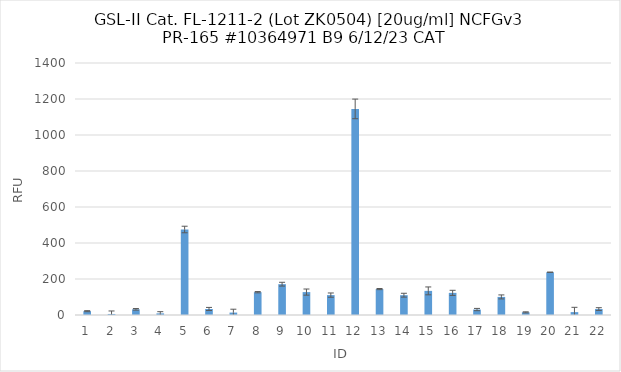
| Category | RFU |
|---|---|
| 0 | 21.25 |
| 1 | 5.75 |
| 2 | 31.5 |
| 3 | 9 |
| 4 | 475 |
| 5 | 33.5 |
| 6 | 13.5 |
| 7 | 126.75 |
| 8 | 171.25 |
| 9 | 127.25 |
| 10 | 110.5 |
| 11 | 1145 |
| 12 | 144 |
| 13 | 110 |
| 14 | 134 |
| 15 | 123 |
| 16 | 30.25 |
| 17 | 100.5 |
| 18 | 14.75 |
| 19 | 237.5 |
| 20 | 16 |
| 21 | 33 |